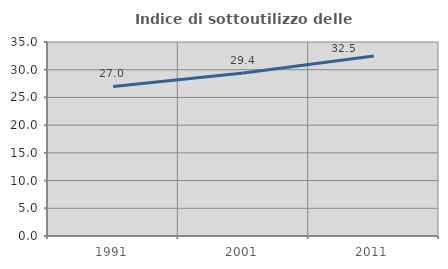
| Category | Indice di sottoutilizzo delle abitazioni  |
|---|---|
| 1991.0 | 26.984 |
| 2001.0 | 29.405 |
| 2011.0 | 32.478 |